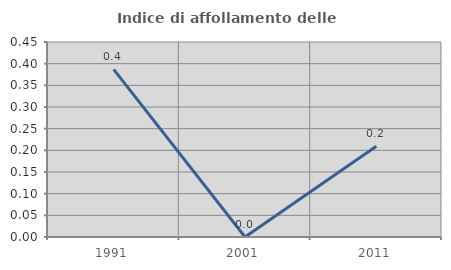
| Category | Indice di affollamento delle abitazioni  |
|---|---|
| 1991.0 | 0.387 |
| 2001.0 | 0 |
| 2011.0 | 0.21 |